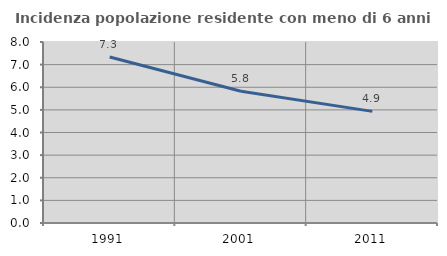
| Category | Incidenza popolazione residente con meno di 6 anni |
|---|---|
| 1991.0 | 7.339 |
| 2001.0 | 5.82 |
| 2011.0 | 4.934 |